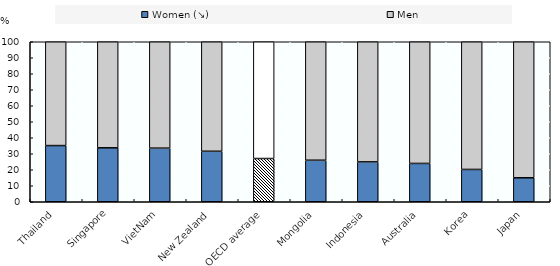
| Category | Women (↘) | Men |
|---|---|---|
| Thailand | 35.109 | 64.891 |
| Singapore | 33.716 | 66.284 |
| VietNam | 33.5 | 66.5 |
| New Zealand | 31.561 | 68.439 |
| OECD average | 27.019 | 72.981 |
| Mongolia | 25.96 | 74.04 |
| Indonesia | 24.917 | 75.083 |
| Australia | 23.953 | 76.047 |
| Korea | 20.205 | 79.795 |
| Japan | 14.985 | 85.015 |